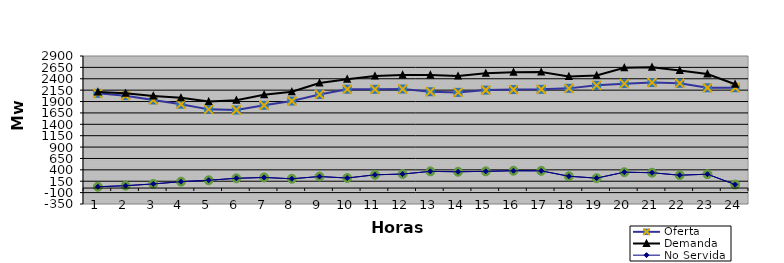
| Category | Oferta | No Servida | Demanda |
|---|---|---|---|
| 1.0 | 2079.53 | 29.316 | 2108.846 |
| 2.0 | 2028.88 | 52.101 | 2080.981 |
| 3.0 | 1933.91 | 90.338 | 2024.248 |
| 4.0 | 1840.93 | 139.991 | 1980.921 |
| 5.0 | 1727.92 | 171.924 | 1899.844 |
| 6.0 | 1714.19 | 214.515 | 1928.705 |
| 7.0 | 1817.25 | 232.585 | 2049.835 |
| 8.0 | 1910.81 | 204.064 | 2114.874 |
| 9.0 | 2055.04 | 253.367 | 2308.407 |
| 10.0 | 2170.83 | 220.643 | 2391.473 |
| 11.0 | 2168.34 | 290.763 | 2459.103 |
| 12.0 | 2174.34 | 308.02 | 2482.36 |
| 13.0 | 2115.67 | 366.622 | 2482.292 |
| 14.0 | 2101.2 | 357.719 | 2458.919 |
| 15.0 | 2150.88 | 367.667 | 2518.547 |
| 16.0 | 2162.85 | 380.058 | 2542.908 |
| 17.0 | 2168.14 | 378.125 | 2546.265 |
| 18.0 | 2189.12 | 259.204 | 2448.324 |
| 19.0 | 2255.08 | 217.997 | 2473.077 |
| 20.0 | 2293.14 | 348.617 | 2641.757 |
| 21.0 | 2317.11 | 336.8 | 2653.91 |
| 22.0 | 2300.76 | 282.294 | 2583.054 |
| 23.0 | 2201.69 | 304.206 | 2505.896 |
| 24.0 | 2203.27 | 77.25 | 2280.52 |